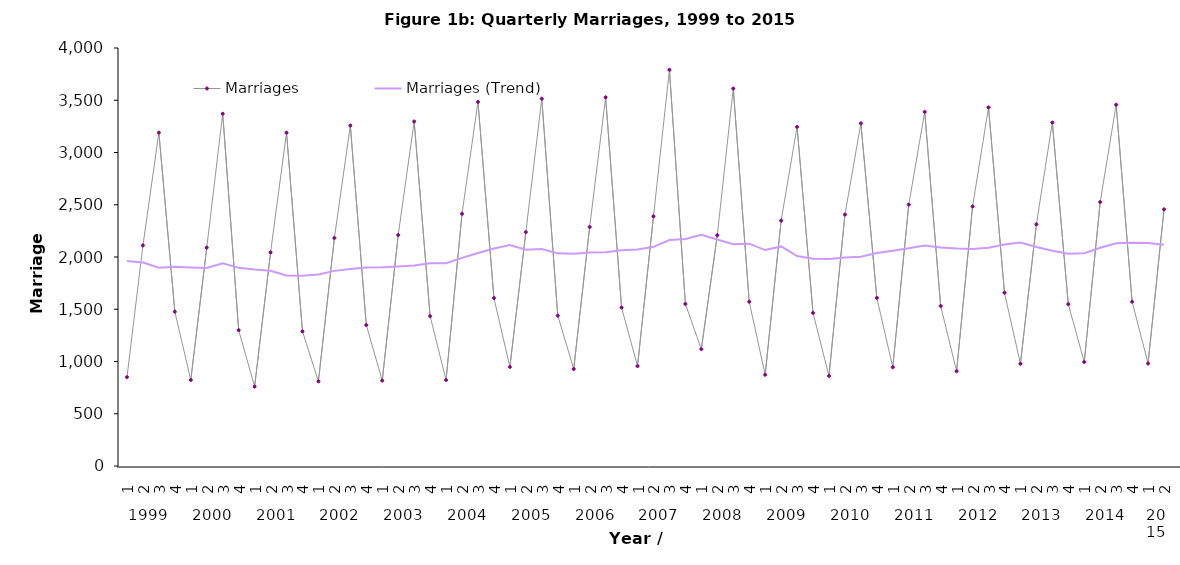
| Category | Marriages | Marriages (Trend) |
|---|---|---|
| 0 | 850 | 1961.25 |
| 1 | 2111 | 1946.75 |
| 2 | 3190 | 1898.25 |
| 3 | 1477 | 1907 |
| 4 | 823 | 1900.25 |
| 5 | 2090 | 1895 |
| 6 | 3371 | 1940.25 |
| 7 | 1300 | 1896 |
| 8 | 760 | 1880.25 |
| 9 | 2044 | 1868.75 |
| 10 | 3189 | 1823.25 |
| 11 | 1288 | 1820.25 |
| 12 | 810 | 1832.75 |
| 13 | 2182 | 1867.25 |
| 14 | 3258 | 1884.5 |
| 15 | 1349 | 1899.75 |
| 16 | 817 | 1901.5 |
| 17 | 2210 | 1908.5 |
| 18 | 3297 | 1918.25 |
| 19 | 1433 | 1939.25 |
| 20 | 822 | 1940.5 |
| 21 | 2414 | 1991.5 |
| 22 | 3485 | 2038.5 |
| 23 | 1607 | 2082 |
| 24 | 948 | 2113.5 |
| 25 | 2238 | 2069.5 |
| 26 | 3515 | 2077 |
| 27 | 1439 | 2035 |
| 28 | 928 | 2030 |
| 29 | 2287 | 2042.25 |
| 30 | 3528 | 2045.5 |
| 31 | 1516 | 2064.75 |
| 32 | 956 | 2071.75 |
| 33 | 2389 | 2097.25 |
| 34 | 3791 | 2163 |
| 35 | 1551 | 2171.75 |
| 36 | 1118 | 2212.25 |
| 37 | 2208 | 2167 |
| 38 | 3612 | 2122.25 |
| 39 | 1572 | 2127.5 |
| 40 | 873 | 2066.25 |
| 41 | 2348 | 2101.25 |
| 42 | 3245 | 2009.5 |
| 43 | 1465 | 1982.75 |
| 44 | 862 | 1980 |
| 45 | 2406 | 1994.5 |
| 46 | 3279 | 2003 |
| 47 | 1609 | 2039 |
| 48 | 945 | 2059.75 |
| 49 | 2501 | 2083.5 |
| 50 | 3389 | 2111 |
| 51 | 1531 | 2091.5 |
| 52 | 907 | 2082 |
| 53 | 2483 | 2077.5 |
| 54 | 3432 | 2088.25 |
| 55 | 1658 | 2120 |
| 56 | 978 | 2137.75 |
| 57 | 2313 | 2095.25 |
| 58 | 3287 | 2059 |
| 59 | 1548 | 2031.5 |
| 60 | 995 | 2035.75 |
| 61 | 2526 | 2089 |
| 62 | 3457 | 2131.5 |
| 63 | 1572 | 2137.5 |
| 64 | 981 | 2134 |
| 65 | 2456 | 2116.5 |